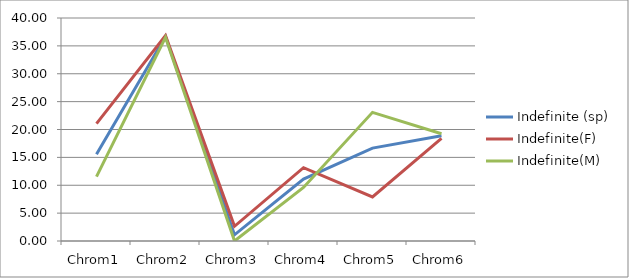
| Category | Indefinite (sp) | Indefinite(F)  | Indefinite(M) |
|---|---|---|---|
| Chrom1 | 15.556 | 21.053 | 11.538 |
| Chrom2 | 36.667 | 36.842 | 36.538 |
| Chrom3 | 1.111 | 2.632 | 0 |
| Chrom4 | 11.111 | 13.158 | 9.615 |
| Chrom5 | 16.667 | 7.895 | 23.077 |
| Chrom6 | 18.889 | 18.421 | 19.231 |